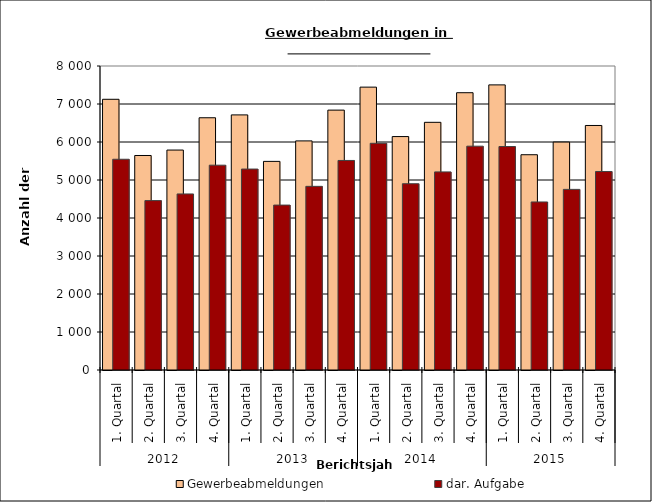
| Category | Gewerbeabmeldungen | dar. Aufgabe |
|---|---|---|
| 0 | 7124 | 5546 |
| 1 | 5645 | 4458 |
| 2 | 5788 | 4633 |
| 3 | 6638 | 5390 |
| 4 | 6713 | 5288 |
| 5 | 5490 | 4340 |
| 6 | 6029 | 4833 |
| 7 | 6839 | 5514 |
| 8 | 7444 | 5966 |
| 9 | 6143 | 4902 |
| 10 | 6518 | 5213 |
| 11 | 7297 | 5890 |
| 12 | 7503 | 5881 |
| 13 | 5665 | 4422 |
| 14 | 5998 | 4753 |
| 15 | 6435 | 5224 |